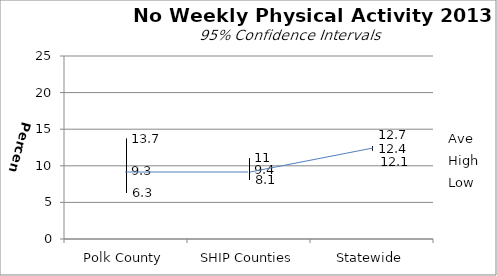
| Category | Ave | High | Low |
|---|---|---|---|
| Polk County | 9.3 | 13.7 | 6.3 |
| SHIP Counties | 9.4 | 11 | 8.1 |
| Statewide | 12.4 | 12.7 | 12.1 |